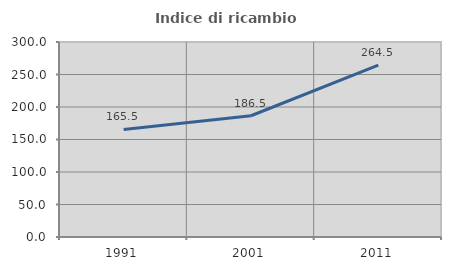
| Category | Indice di ricambio occupazionale  |
|---|---|
| 1991.0 | 165.476 |
| 2001.0 | 186.538 |
| 2011.0 | 264.535 |